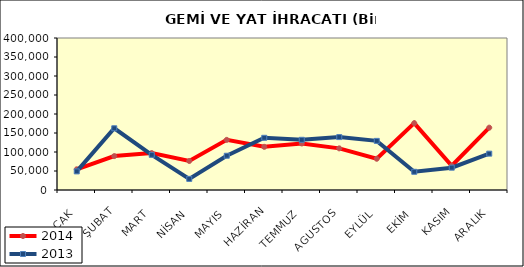
| Category | 2014 | 2013 |
|---|---|---|
| OCAK | 54471.324 | 48952.629 |
| ŞUBAT | 89236.716 | 162402.313 |
| MART | 97135.555 | 92520.589 |
| NİSAN | 76354.088 | 29250.645 |
| MAYIS | 131933.468 | 90162.293 |
| HAZİRAN | 113595.982 | 137339.942 |
| TEMMUZ | 122443.445 | 132087.479 |
| AGUSTOS | 109595.076 | 139231.01 |
| EYLÜL | 82221.245 | 129271.494 |
| EKİM | 175946.589 | 47933.185 |
| KASIM | 63880.74 | 58766.617 |
| ARALIK | 164063.339 | 95673.192 |